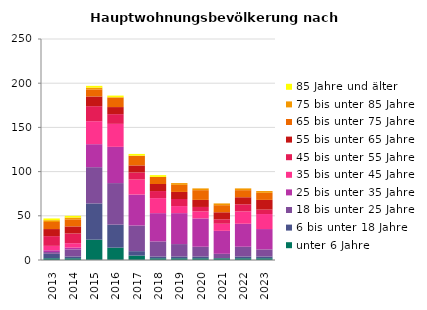
| Category | unter 6 Jahre | 6 bis unter 18 Jahre | 18 bis unter 25 Jahre | 25 bis unter 35 Jahre | 35 bis unter 45 Jahre | 45 bis unter 55 Jahre | 55 bis unter 65 Jahre | 65 bis unter 75 Jahre | 75 bis unter 85 Jahre | 85 Jahre und älter |
|---|---|---|---|---|---|---|---|---|---|---|
| 2013.0 | 2 | 5 | 2 | 2 | 5 | 11 | 8 | 8 | 2 | 2 |
| 2014.0 | 2 | 2 | 8 | 2 | 5 | 11 | 8 | 8 | 2 | 2 |
| 2015.0 | 23 | 41 | 41 | 26 | 26 | 17 | 11 | 8 | 2 | 2 |
| 2016.0 | 14 | 26 | 47 | 41 | 26 | 11 | 8 | 11 | 0 | 2 |
| 2017.0 | 5 | 5 | 29 | 35 | 17 | 8 | 8 | 11 | 0 | 2 |
| 2018.0 | 2 | 2 | 17 | 32 | 17 | 8 | 8 | 8 | 0 | 2 |
| 2019.0 | 2 | 2 | 14 | 35 | 8 | 8 | 8 | 8 | 2 | 0 |
| 2020.0 | 2 | 2 | 11 | 32 | 8 | 5 | 8 | 11 | 2 | 0 |
| 2021.0 | 2 | 0 | 5 | 26 | 8 | 5 | 8 | 8 | 2 | 0 |
| 2022.0 | 2 | 2 | 11 | 26 | 14 | 8 | 8 | 8 | 2 | 0 |
| 2023.0 | 2 | 2 | 8 | 23 | 17 | 5 | 11 | 8 | 2 | 0 |